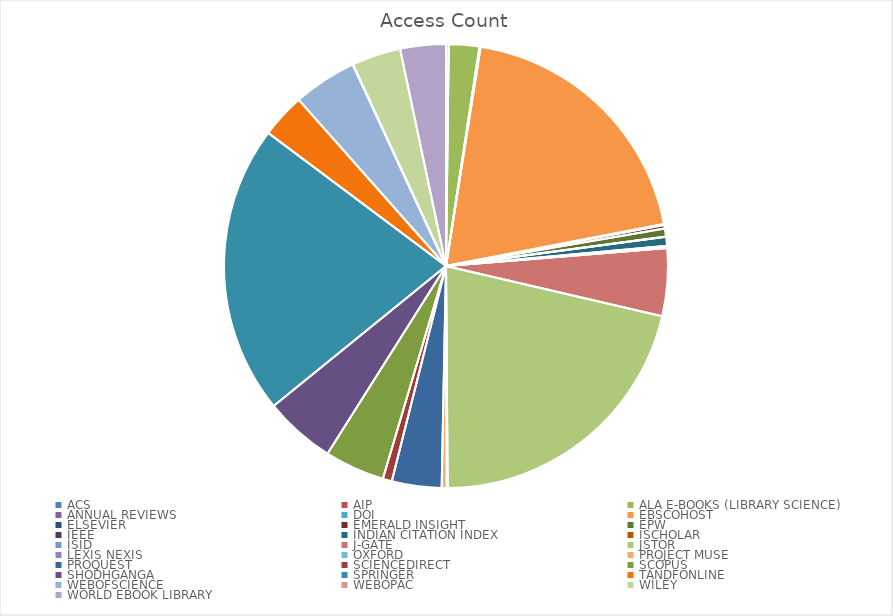
| Category | Access Count |
|---|---|
| ACS | 43 |
| AIP | 2 |
| ALA E-BOOKS (LIBRARY SCIENCE) | 519 |
| ANNUAL REVIEWS | 6 |
| DOI | 14 |
| EBSCOHOST | 4555 |
| ELSEVIER | 19 |
| EMERALD INSIGHT | 58 |
| EPW | 138 |
| IEEE | 2 |
| INDIAN CITATION INDEX | 153 |
| ISCHOLAR | 35 |
| ISID | 2 |
| J-GATE | 1154 |
| JSTOR | 4969 |
| LEXIS NEXIS | 4 |
| OXFORD | 12 |
| PROJECT MUSE | 85 |
| PROQUEST | 846 |
| SCIENCEDIRECT | 155 |
| SCOPUS | 1023 |
| SHODHGANGA | 1212 |
| SPRINGER | 4931 |
| TANDFONLINE | 757 |
| WEBOFSCIENCE | 1084 |
| WEBOPAC | 7 |
| WILEY | 832 |
| WORLD EBOOK LIBRARY | 777 |